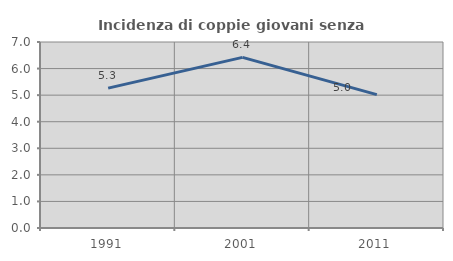
| Category | Incidenza di coppie giovani senza figli |
|---|---|
| 1991.0 | 5.263 |
| 2001.0 | 6.422 |
| 2011.0 | 5.021 |